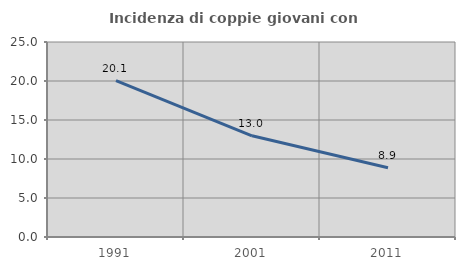
| Category | Incidenza di coppie giovani con figli |
|---|---|
| 1991.0 | 20.058 |
| 2001.0 | 12.979 |
| 2011.0 | 8.889 |